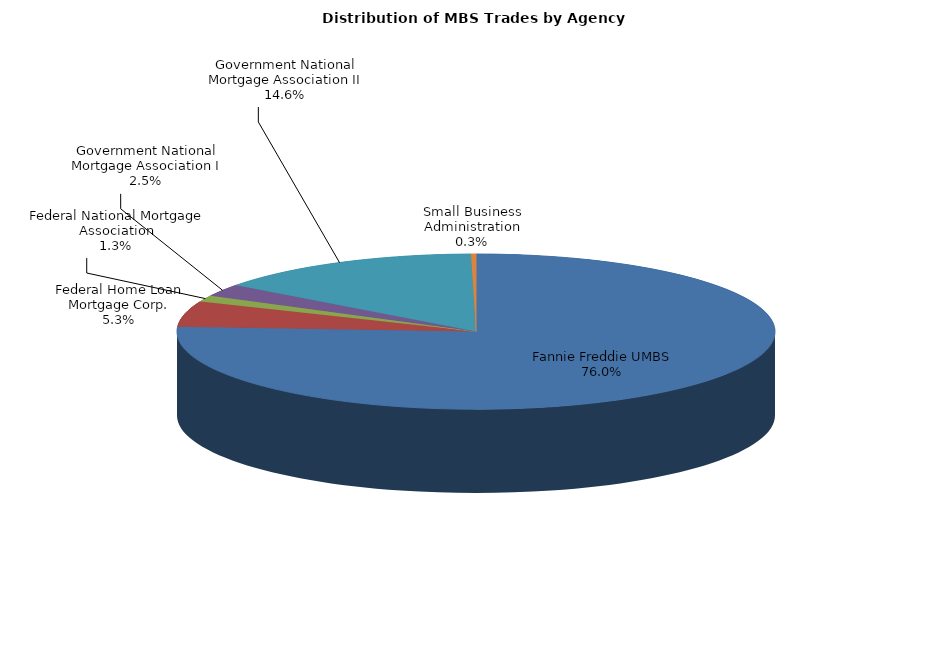
| Category | Series 0 |
|---|---|
| Fannie Freddie UMBS | 4432.836 |
| Federal Home Loan Mortgage Corp. | 311.536 |
| Federal National Mortgage Association | 76.548 |
| Government National Mortgage Association I | 147.764 |
| Government National Mortgage Association II | 848.808 |
| Small Business Administration | 15.612 |